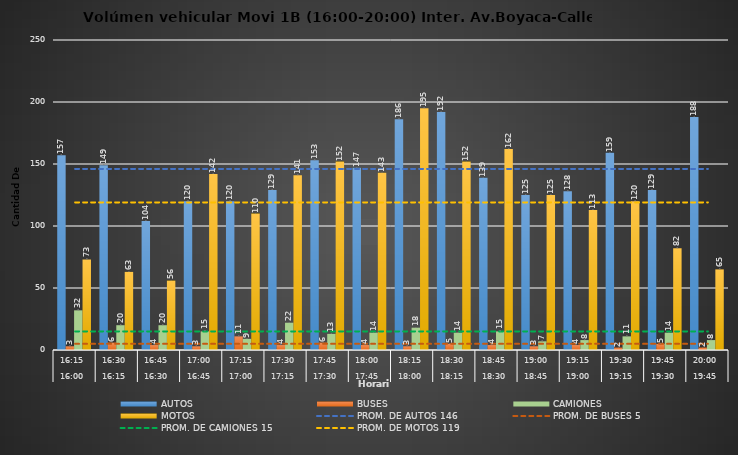
| Category | AUTOS | BUSES | CAMIONES | MOTOS |
|---|---|---|---|---|
| 0 | 157 | 3 | 32 | 73 |
| 1 | 149 | 6 | 20 | 63 |
| 2 | 104 | 4 | 20 | 56 |
| 3 | 120 | 3 | 15 | 142 |
| 4 | 120 | 11 | 9 | 110 |
| 5 | 129 | 4 | 22 | 141 |
| 6 | 153 | 6 | 13 | 152 |
| 7 | 147 | 4 | 14 | 143 |
| 8 | 186 | 3 | 18 | 195 |
| 9 | 192 | 5 | 14 | 152 |
| 10 | 139 | 4 | 15 | 162 |
| 11 | 125 | 3 | 7 | 125 |
| 12 | 128 | 4 | 8 | 113 |
| 13 | 159 | 2 | 11 | 120 |
| 14 | 129 | 5 | 14 | 82 |
| 15 | 188 | 2 | 8 | 65 |